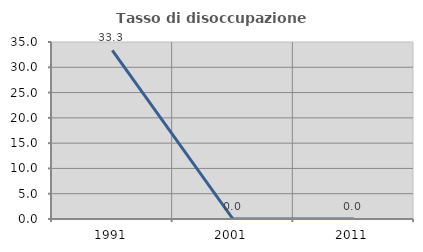
| Category | Tasso di disoccupazione giovanile  |
|---|---|
| 1991.0 | 33.333 |
| 2001.0 | 0 |
| 2011.0 | 0 |